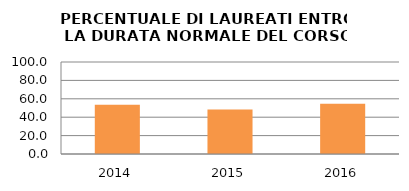
| Category | 2014 2015 2016 |
|---|---|
| 2014.0 | 53.659 |
| 2015.0 | 48.485 |
| 2016.0 | 54.717 |